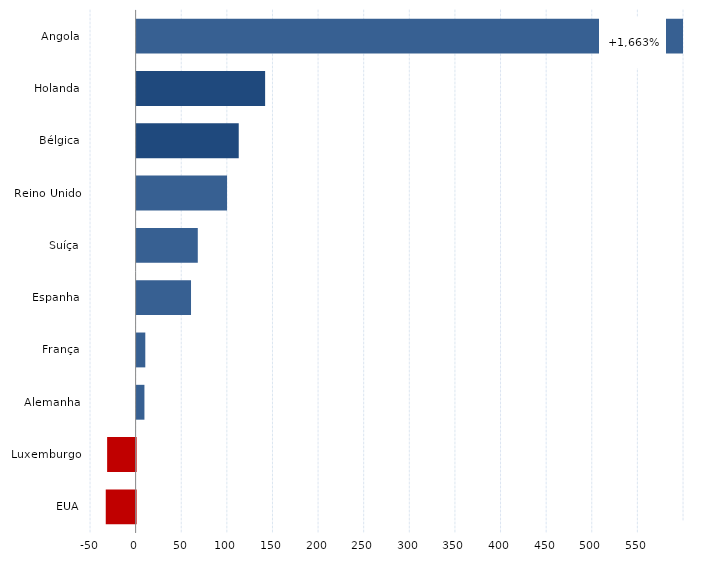
| Category | Series 0 |
|---|---|
| Angola | 1663.445 |
| Holanda | 140.865 |
| Bélgica | 111.939 |
| Reino Unido | 99.128 |
| Suíça | 67.05 |
| Espanha | 59.641 |
| França | 9.521 |
| Alemanha | 8.566 |
| Luxemburgo | -31.218 |
| EUA | -32.732 |